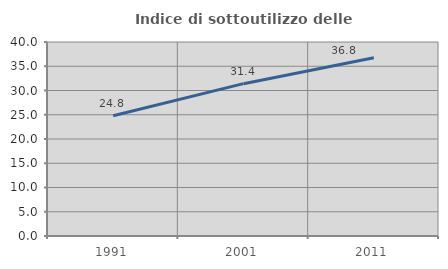
| Category | Indice di sottoutilizzo delle abitazioni  |
|---|---|
| 1991.0 | 24.79 |
| 2001.0 | 31.411 |
| 2011.0 | 36.77 |